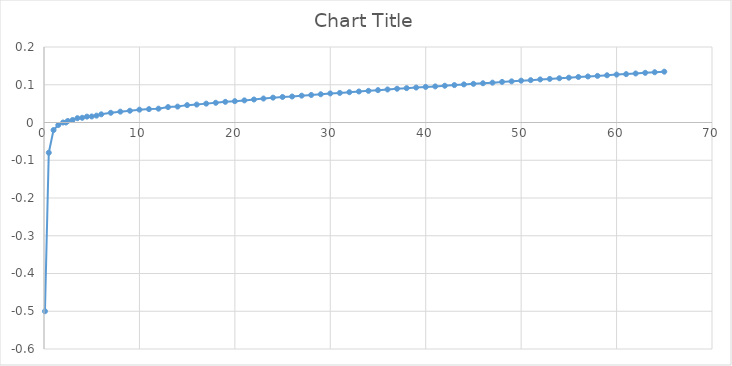
| Category | Series 0 |
|---|---|
| 0.1 | -0.5 |
| 0.5 | -0.08 |
| 1.0 | -0.02 |
| 1.5 | -0.007 |
| 2.0 | 0 |
| 2.3 | 0 |
| 2.5 | 0.004 |
| 3.0 | 0.007 |
| 3.5 | 0.011 |
| 4.0 | 0.012 |
| 4.5 | 0.016 |
| 5.0 | 0.016 |
| 5.5 | 0.018 |
| 6.0 | 0.022 |
| 7.0 | 0.026 |
| 8.0 | 0.029 |
| 9.0 | 0.031 |
| 10.0 | 0.034 |
| 11.0 | 0.035 |
| 12.0 | 0.037 |
| 13.0 | 0.041 |
| 14.0 | 0.042 |
| 15.0 | 0.046 |
| 16.0 | 0.048 |
| 17.0 | 0.05 |
| 18.0 | 0.052 |
| 19.0 | 0.055 |
| 20.0 | 0.056 |
| 21.0 | 0.059 |
| 22.0 | 0.061 |
| 23.0 | 0.063 |
| 24.0 | 0.066 |
| 25.0 | 0.068 |
| 26.0 | 0.069 |
| 27.0 | 0.071 |
| 28.0 | 0.073 |
| 29.0 | 0.075 |
| 30.0 | 0.077 |
| 31.0 | 0.078 |
| 32.0 | 0.08 |
| 33.0 | 0.082 |
| 34.0 | 0.084 |
| 35.0 | 0.086 |
| 36.0 | 0.088 |
| 37.0 | 0.089 |
| 38.0 | 0.091 |
| 39.0 | 0.093 |
| 40.0 | 0.094 |
| 41.0 | 0.096 |
| 42.0 | 0.097 |
| 43.0 | 0.099 |
| 44.0 | 0.101 |
| 45.0 | 0.102 |
| 46.0 | 0.104 |
| 47.0 | 0.106 |
| 48.0 | 0.108 |
| 49.0 | 0.109 |
| 50.0 | 0.111 |
| 51.0 | 0.112 |
| 52.0 | 0.114 |
| 53.0 | 0.115 |
| 54.0 | 0.117 |
| 55.0 | 0.119 |
| 56.0 | 0.121 |
| 57.0 | 0.122 |
| 58.0 | 0.123 |
| 59.0 | 0.125 |
| 60.0 | 0.127 |
| 61.0 | 0.128 |
| 62.0 | 0.13 |
| 63.0 | 0.132 |
| 64.0 | 0.133 |
| 65.0 | 0.135 |